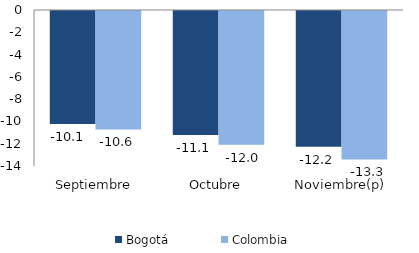
| Category | Bogotá | Colombia |
|---|---|---|
| Septiembre | -10.135 | -10.633 |
| Octubre | -11.139 | -12.007 |
| Noviembre(p) | -12.184 | -13.324 |